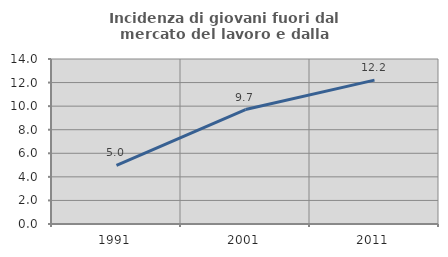
| Category | Incidenza di giovani fuori dal mercato del lavoro e dalla formazione  |
|---|---|
| 1991.0 | 4.984 |
| 2001.0 | 9.712 |
| 2011.0 | 12.205 |